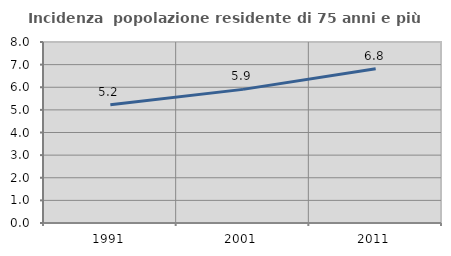
| Category | Incidenza  popolazione residente di 75 anni e più |
|---|---|
| 1991.0 | 5.23 |
| 2001.0 | 5.906 |
| 2011.0 | 6.821 |